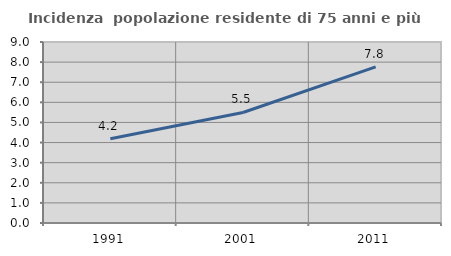
| Category | Incidenza  popolazione residente di 75 anni e più |
|---|---|
| 1991.0 | 4.191 |
| 2001.0 | 5.495 |
| 2011.0 | 7.762 |